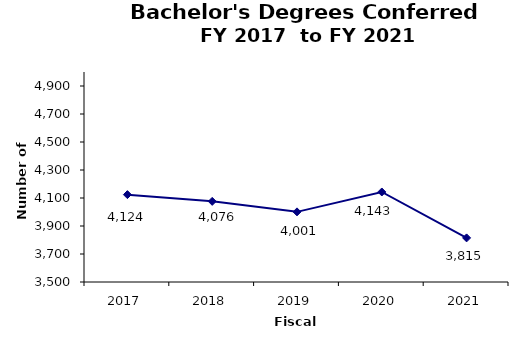
| Category | Series 0 |
|---|---|
| 2017.0 | 4124 |
| 2018.0 | 4076 |
| 2019.0 | 4001 |
| 2020.0 | 4143 |
| 2021.0 | 3815 |